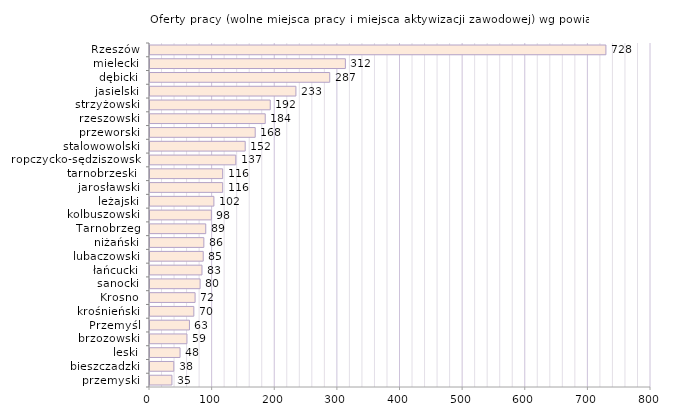
| Category | Oferty pracy (wolne miejsca pracy i miejsca aktywizacji zawodowej) wg powiatów |
|---|---|
| przemyski | 35 |
| bieszczadzki | 38 |
| leski | 48 |
| brzozowski | 59 |
| Przemyśl | 63 |
| krośnieński | 70 |
| Krosno | 72 |
| sanocki | 80 |
| łańcucki | 83 |
| lubaczowski | 85 |
| niżański | 86 |
| Tarnobrzeg | 89 |
| kolbuszowski | 98 |
| leżajski | 102 |
| jarosławski | 116 |
| tarnobrzeski  | 116 |
| ropczycko-sędziszowski | 137 |
| stalowowolski | 152 |
| przeworski | 168 |
| rzeszowski | 184 |
| strzyżowski | 192 |
| jasielski | 233 |
| dębicki | 287 |
| mielecki | 312 |
| Rzeszów | 728 |